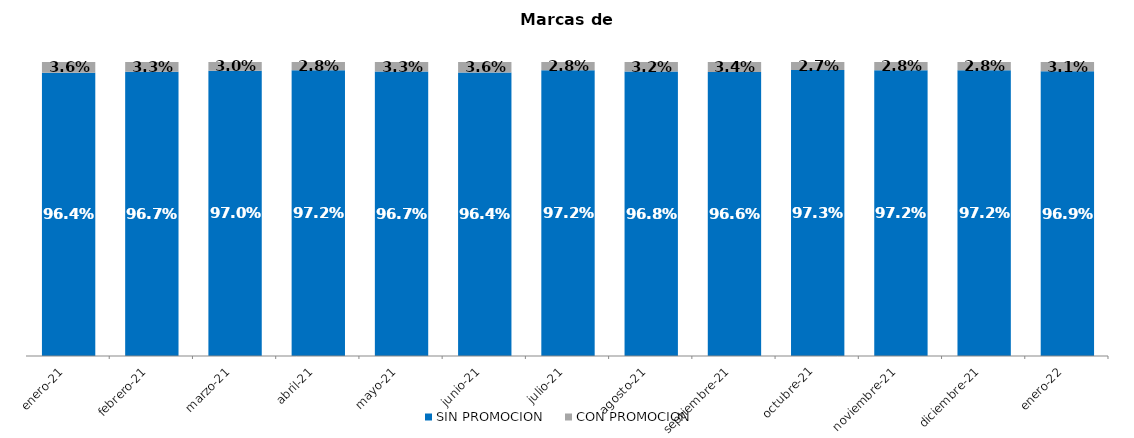
| Category | SIN PROMOCION   | CON PROMOCION   |
|---|---|---|
| 2021-01-01 | 0.964 | 0.036 |
| 2021-02-01 | 0.967 | 0.033 |
| 2021-03-01 | 0.97 | 0.03 |
| 2021-04-01 | 0.972 | 0.028 |
| 2021-05-01 | 0.967 | 0.033 |
| 2021-06-01 | 0.964 | 0.036 |
| 2021-07-01 | 0.972 | 0.028 |
| 2021-08-01 | 0.968 | 0.032 |
| 2021-09-01 | 0.966 | 0.034 |
| 2021-10-01 | 0.973 | 0.027 |
| 2021-11-01 | 0.972 | 0.028 |
| 2021-12-01 | 0.972 | 0.028 |
| 2022-01-01 | 0.969 | 0.031 |